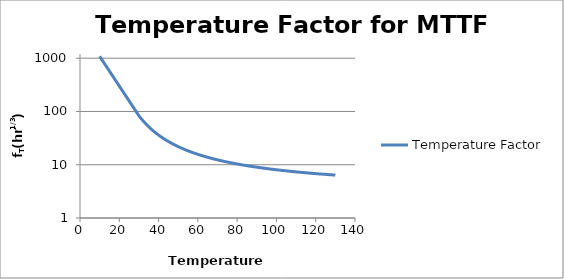
| Category | Temperature Factor |
|---|---|
| 10.0 | 1086.639 |
| 11.0 | 955.741 |
| 12.0 | 840.388 |
| 13.0 | 738.958 |
| 14.0 | 649.771 |
| 15.0 | 571.347 |
| 16.0 | 502.389 |
| 17.0 | 441.754 |
| 18.0 | 388.436 |
| 19.0 | 341.554 |
| 20.0 | 300.331 |
| 21.0 | 264.083 |
| 22.0 | 232.21 |
| 23.0 | 204.183 |
| 24.0 | 179.54 |
| 25.0 | 157.87 |
| 26.0 | 138.816 |
| 27.0 | 122.062 |
| 28.0 | 107.33 |
| 29.0 | 94.376 |
| 30.0 | 82.974 |
| 31.0 | 74.515 |
| 32.0 | 67.369 |
| 33.0 | 61.282 |
| 34.0 | 56.057 |
| 35.0 | 51.539 |
| 36.0 | 47.606 |
| 37.0 | 44.163 |
| 38.0 | 41.131 |
| 39.0 | 38.447 |
| 40.0 | 36.06 |
| 41.0 | 33.927 |
| 42.0 | 32.013 |
| 43.0 | 30.289 |
| 44.0 | 28.729 |
| 45.0 | 27.314 |
| 46.0 | 26.026 |
| 47.0 | 24.85 |
| 48.0 | 23.772 |
| 49.0 | 22.783 |
| 50.0 | 21.872 |
| 51.0 | 21.03 |
| 52.0 | 20.252 |
| 53.0 | 19.531 |
| 54.0 | 18.86 |
| 55.0 | 18.236 |
| 56.0 | 17.653 |
| 57.0 | 17.108 |
| 58.0 | 16.599 |
| 59.0 | 16.121 |
| 60.0 | 15.672 |
| 61.0 | 15.249 |
| 62.0 | 14.851 |
| 63.0 | 14.476 |
| 64.0 | 14.121 |
| 65.0 | 13.786 |
| 66.0 | 13.468 |
| 67.0 | 13.167 |
| 68.0 | 12.881 |
| 69.0 | 12.61 |
| 70.0 | 12.351 |
| 71.0 | 12.105 |
| 72.0 | 11.871 |
| 73.0 | 11.647 |
| 74.0 | 11.433 |
| 75.0 | 11.229 |
| 76.0 | 11.034 |
| 77.0 | 10.847 |
| 78.0 | 10.668 |
| 79.0 | 10.496 |
| 80.0 | 10.331 |
| 81.0 | 10.173 |
| 82.0 | 10.021 |
| 83.0 | 9.875 |
| 84.0 | 9.734 |
| 85.0 | 9.599 |
| 86.0 | 9.469 |
| 87.0 | 9.343 |
| 88.0 | 9.222 |
| 89.0 | 9.105 |
| 90.0 | 8.992 |
| 91.0 | 8.883 |
| 92.0 | 8.777 |
| 93.0 | 8.675 |
| 94.0 | 8.576 |
| 95.0 | 8.481 |
| 96.0 | 8.388 |
| 97.0 | 8.299 |
| 98.0 | 8.212 |
| 99.0 | 8.128 |
| 100.0 | 8.046 |
| 101.0 | 7.967 |
| 102.0 | 7.89 |
| 103.0 | 7.815 |
| 104.0 | 7.743 |
| 105.0 | 7.672 |
| 106.0 | 7.603 |
| 107.0 | 7.537 |
| 108.0 | 7.472 |
| 109.0 | 7.408 |
| 110.0 | 7.347 |
| 111.0 | 7.287 |
| 112.0 | 7.229 |
| 113.0 | 7.172 |
| 114.0 | 7.116 |
| 115.0 | 7.062 |
| 116.0 | 7.009 |
| 117.0 | 6.958 |
| 118.0 | 6.908 |
| 119.0 | 6.859 |
| 120.0 | 6.811 |
| 121.0 | 6.764 |
| 122.0 | 6.718 |
| 123.0 | 6.674 |
| 124.0 | 6.63 |
| 125.0 | 6.588 |
| 126.0 | 6.546 |
| 127.0 | 6.505 |
| 128.0 | 6.465 |
| 129.0 | 6.426 |
| 130.0 | 6.388 |